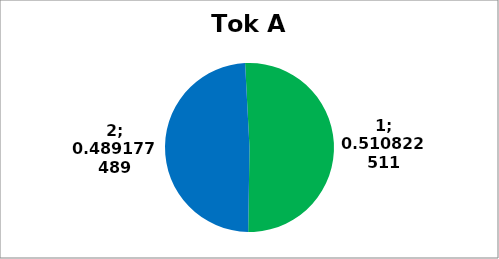
| Category | Series 0 |
|---|---|
| 0 | 118 |
| 1 | 113 |